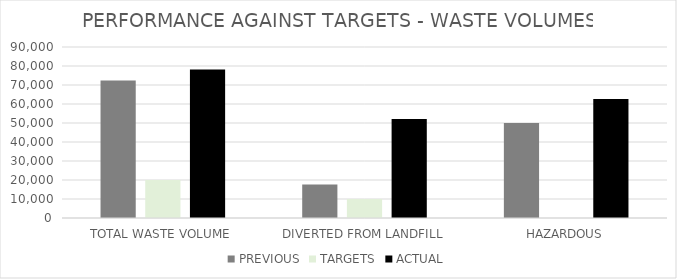
| Category | PREVIOUS | TARGETS | ACTUAL |
|---|---|---|---|
| TOTAL WASTE VOLUME | 72345 | 20000 | 78214.286 |
| DIVERTED FROM LANDFILL | 17600 | 10000 | 52142.857 |
| HAZARDOUS | 50000 | 0 | 62571.429 |